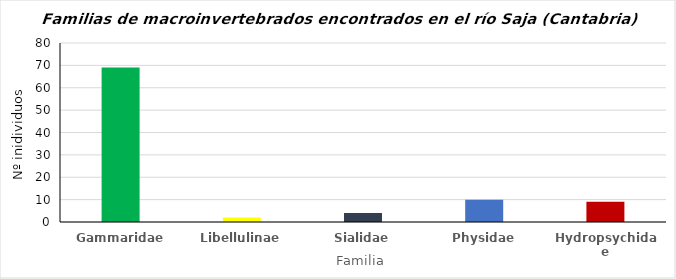
| Category | Series 0 |
|---|---|
| Gammaridae | 69 |
| Libellulinae | 2 |
| Sialidae | 4 |
| Physidae | 10 |
| Hydropsychidae | 9 |